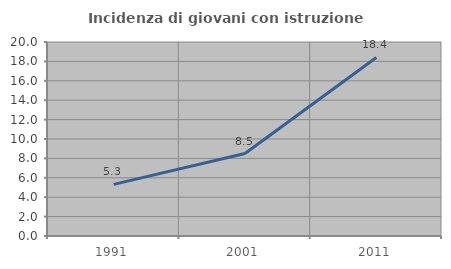
| Category | Incidenza di giovani con istruzione universitaria |
|---|---|
| 1991.0 | 5.319 |
| 2001.0 | 8.503 |
| 2011.0 | 18.409 |